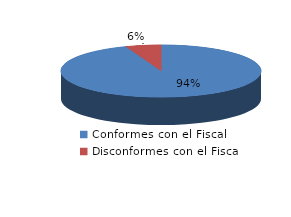
| Category | Series 0 |
|---|---|
| 0 | 1318 |
| 1 | 80 |